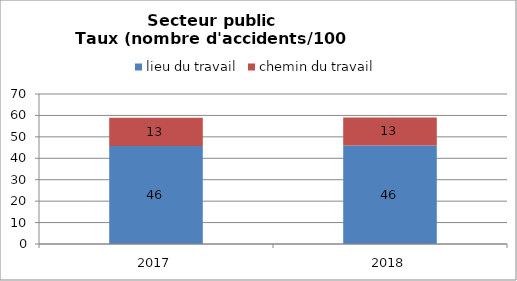
| Category | lieu du travail | chemin du travail |
|---|---|---|
| 2017.0 | 45.772 | 13.173 |
| 2018.0 | 45.987 | 13.092 |